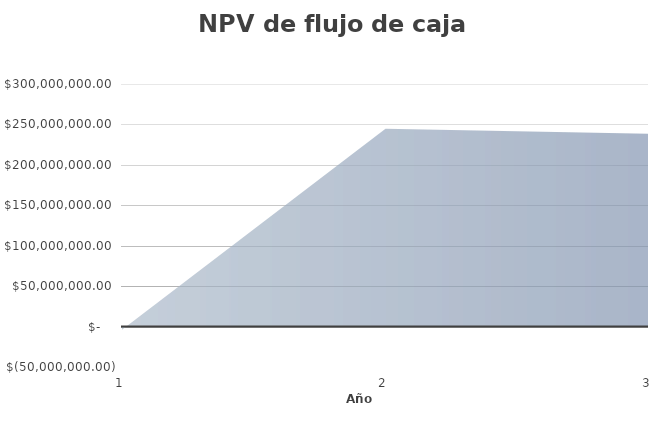
| Category | Series 0 |
|---|---|
| 0 | -4000000 |
| 1 | 244600000 |
| 2 | 238520000 |